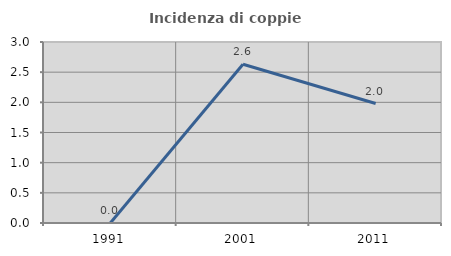
| Category | Incidenza di coppie miste |
|---|---|
| 1991.0 | 0 |
| 2001.0 | 2.632 |
| 2011.0 | 1.98 |